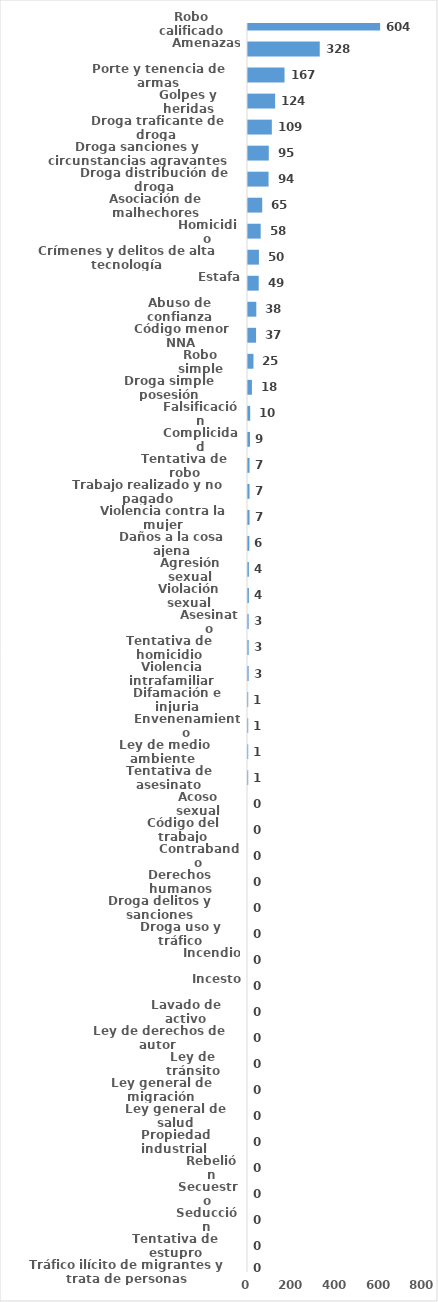
| Category | Series 0 |
|---|---|
| Robo calificado | 604 |
| Amenazas | 328 |
| Porte y tenencia de armas | 167 |
| Golpes y heridas | 124 |
| Droga traficante de droga  | 109 |
| Droga sanciones y circunstancias agravantes | 95 |
| Droga distribución de droga | 94 |
| Asociación de malhechores | 65 |
| Homicidio | 58 |
| Crímenes y delitos de alta tecnología | 50 |
| Estafa | 49 |
| Abuso de confianza | 38 |
| Código menor NNA | 37 |
| Robo simple | 25 |
| Droga simple posesión | 18 |
| Falsificación | 10 |
| Complicidad | 9 |
| Tentativa de robo | 7 |
| Trabajo realizado y no pagado | 7 |
| Violencia contra la mujer | 7 |
| Daños a la cosa ajena | 6 |
| Agresión sexual | 4 |
| Violación sexual | 4 |
| Asesinato | 3 |
| Tentativa de homicidio | 3 |
| Violencia intrafamiliar | 3 |
| Difamación e injuria | 1 |
| Envenenamiento | 1 |
| Ley de medio ambiente  | 1 |
| Tentativa de asesinato | 1 |
| Acoso sexual | 0 |
| Código del trabajo | 0 |
| Contrabando | 0 |
| Derechos humanos | 0 |
| Droga delitos y sanciones | 0 |
| Droga uso y tráfico | 0 |
| Incendio | 0 |
| Incesto | 0 |
| Lavado de activo | 0 |
| Ley de derechos de autor  | 0 |
| Ley de tránsito | 0 |
| Ley general de migración | 0 |
| Ley general de salud | 0 |
| Propiedad industrial  | 0 |
| Rebelión | 0 |
| Secuestro | 0 |
| Seducción | 0 |
| Tentativa de estupro | 0 |
| Tráfico ilícito de migrantes y trata de personas | 0 |